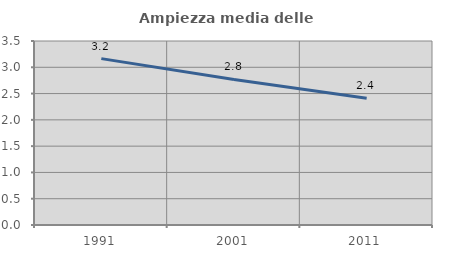
| Category | Ampiezza media delle famiglie |
|---|---|
| 1991.0 | 3.165 |
| 2001.0 | 2.769 |
| 2011.0 | 2.411 |